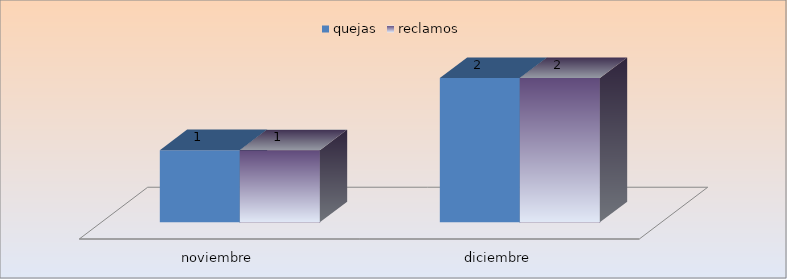
| Category | quejas | reclamos |
|---|---|---|
| noviembre | 1 | 1 |
| diciembre | 2 | 2 |